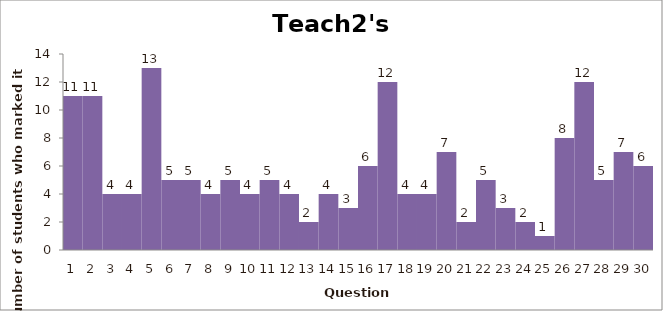
| Category | Series 0 |
|---|---|
| 0 | 11 |
| 1 | 11 |
| 2 | 4 |
| 3 | 4 |
| 4 | 13 |
| 5 | 5 |
| 6 | 5 |
| 7 | 4 |
| 8 | 5 |
| 9 | 4 |
| 10 | 5 |
| 11 | 4 |
| 12 | 2 |
| 13 | 4 |
| 14 | 3 |
| 15 | 6 |
| 16 | 12 |
| 17 | 4 |
| 18 | 4 |
| 19 | 7 |
| 20 | 2 |
| 21 | 5 |
| 22 | 3 |
| 23 | 2 |
| 24 | 1 |
| 25 | 8 |
| 26 | 12 |
| 27 | 5 |
| 28 | 7 |
| 29 | 6 |